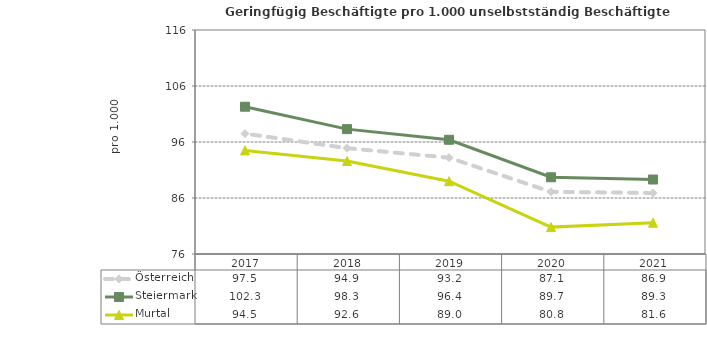
| Category | Österreich | Steiermark | Murtal |
|---|---|---|---|
| 2021.0 | 86.9 | 89.3 | 81.6 |
| 2020.0 | 87.1 | 89.7 | 80.8 |
| 2019.0 | 93.2 | 96.4 | 89 |
| 2018.0 | 94.9 | 98.3 | 92.6 |
| 2017.0 | 97.5 | 102.3 | 94.5 |